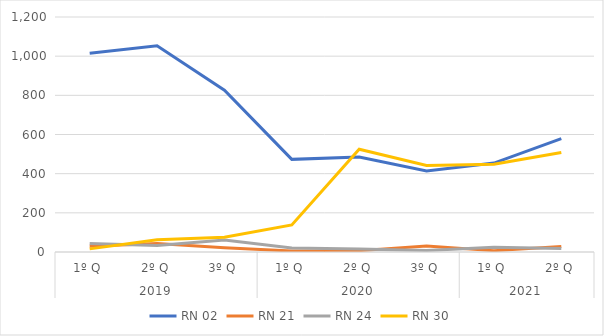
| Category | RN 02 | RN 21 | RN 24 | RN 30 |
|---|---|---|---|---|
| 0 | 1015 | 29 | 44 | 16 |
| 1 | 1053 | 44 | 33 | 62 |
| 2 | 826 | 22 | 61 | 75 |
| 3 | 473 | 5 | 21 | 138 |
| 4 | 485 | 7 | 15 | 525 |
| 5 | 414 | 31 | 8 | 442 |
| 6 | 454 | 7 | 24 | 448 |
| 7 | 579 | 28 | 18 | 508 |